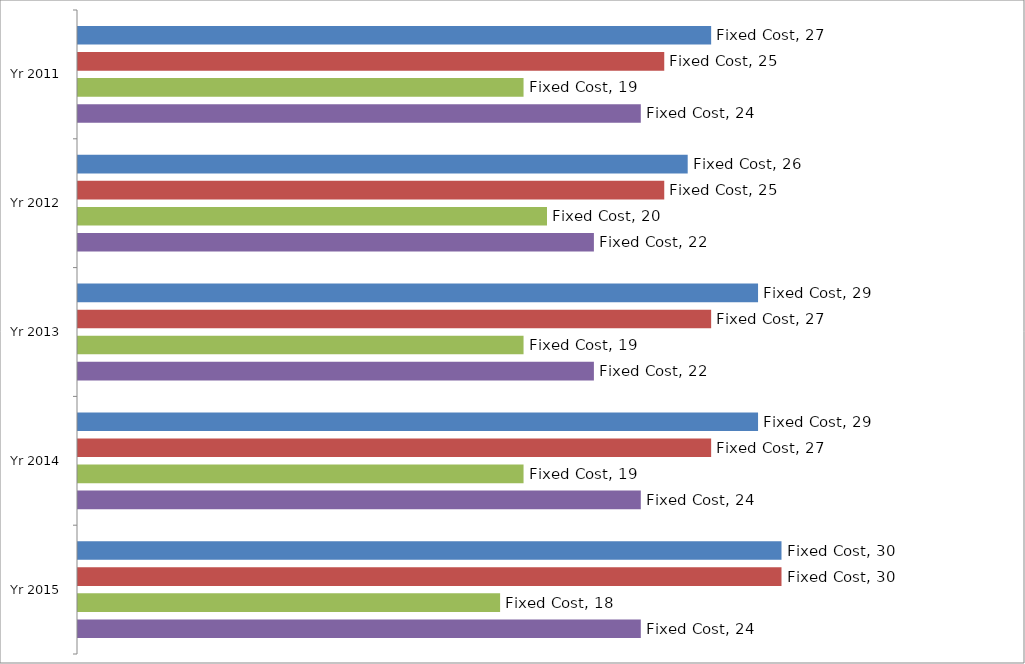
| Category | ACC Ltd - Fixed Cost | Ambuja Cement - Fixed Cost | JK Lakshmi Cement - Fixed Cost | Ultratech Cement - Fixed Cost |
|---|---|---|---|---|
| Yr 2011 | 27 | 25 | 19 | 24 |
| Yr 2012 | 26 | 25 | 20 | 22 |
| Yr 2013 | 29 | 27 | 19 | 22 |
| Yr 2014 | 29 | 27 | 19 | 24 |
| Yr 2015 | 30 | 30 | 18 | 24 |